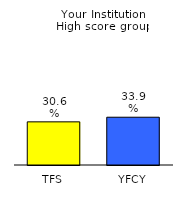
| Category | Series 0 |
|---|---|
| TFS | 0.306 |
| YFCY | 0.339 |